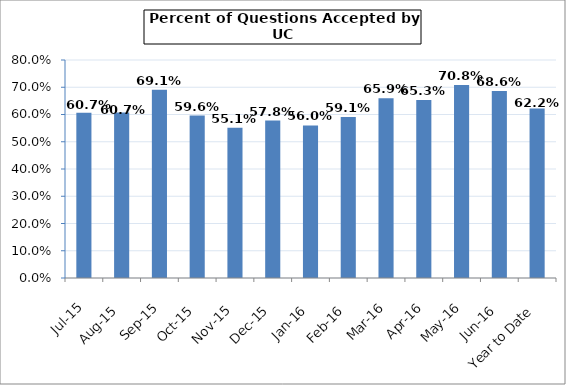
| Category | Series 0 |
|---|---|
| Jul-15 | 0.607 |
| Aug-15 | 0.607 |
| Sep-15 | 0.691 |
| Oct-15 | 0.596 |
| Nov-15 | 0.551 |
| Dec-15 | 0.578 |
| Jan-16 | 0.56 |
| Feb-16 | 0.591 |
| Mar-16 | 0.659 |
| Apr-16 | 0.653 |
| May-16 | 0.708 |
| Jun-16 | 0.686 |
| Year to Date | 0.622 |